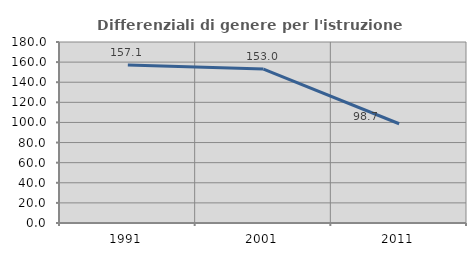
| Category | Differenziali di genere per l'istruzione superiore |
|---|---|
| 1991.0 | 157.148 |
| 2001.0 | 153.043 |
| 2011.0 | 98.716 |